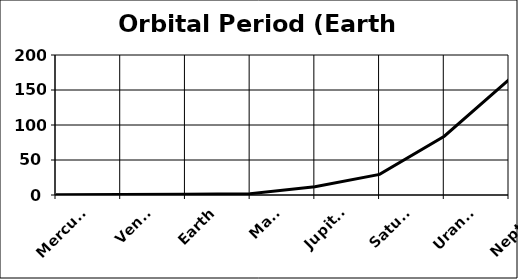
| Category | Orbital Period (Earth years) |
|---|---|
| Mercury | 0.24 |
| Venus | 0.62 |
| Earth | 1 |
| Mars | 1.88 |
| Jupiter | 11.86 |
| Saturn | 29.46 |
| Uranus | 84.01 |
| Neptune | 164.8 |